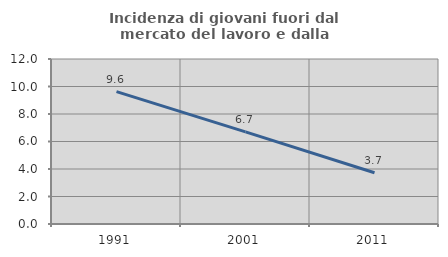
| Category | Incidenza di giovani fuori dal mercato del lavoro e dalla formazione  |
|---|---|
| 1991.0 | 9.63 |
| 2001.0 | 6.701 |
| 2011.0 | 3.723 |